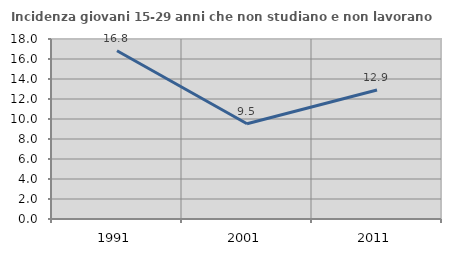
| Category | Incidenza giovani 15-29 anni che non studiano e non lavorano  |
|---|---|
| 1991.0 | 16.832 |
| 2001.0 | 9.524 |
| 2011.0 | 12.903 |